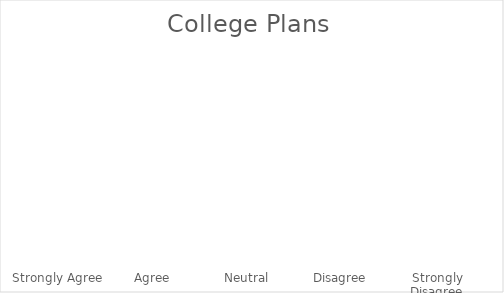
| Category | Series 0 |
|---|---|
| Strongly Agree | 0 |
| Agree | 0 |
| Neutral | 0 |
| Disagree | 0 |
| Strongly Disagree | 0 |